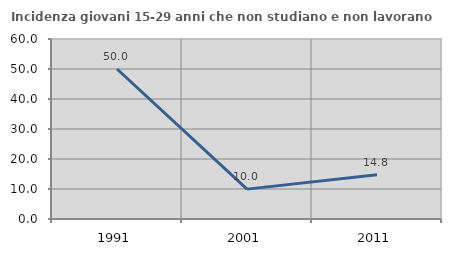
| Category | Incidenza giovani 15-29 anni che non studiano e non lavorano  |
|---|---|
| 1991.0 | 50 |
| 2001.0 | 9.959 |
| 2011.0 | 14.783 |